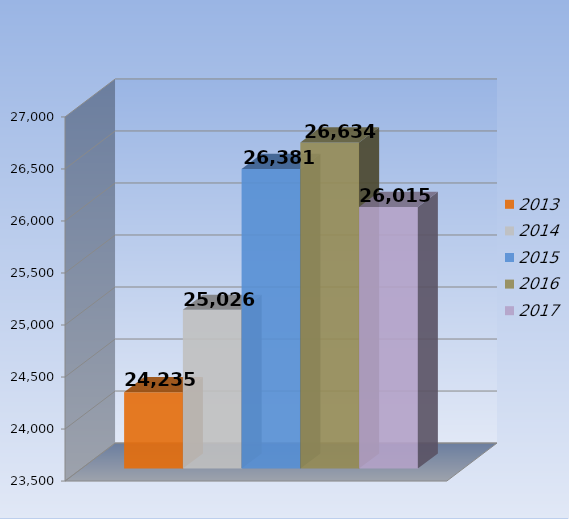
| Category | 2013 | 2014 | 2015 | 2016 | 2017 |
|---|---|---|---|---|---|
| 0 | 24235 | 25026 | 26381 | 26634 | 26015 |